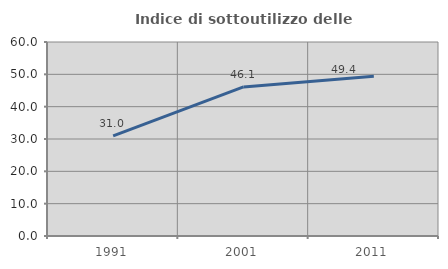
| Category | Indice di sottoutilizzo delle abitazioni  |
|---|---|
| 1991.0 | 30.994 |
| 2001.0 | 46.108 |
| 2011.0 | 49.405 |